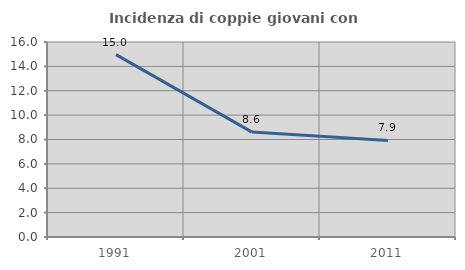
| Category | Incidenza di coppie giovani con figli |
|---|---|
| 1991.0 | 14.968 |
| 2001.0 | 8.606 |
| 2011.0 | 7.927 |